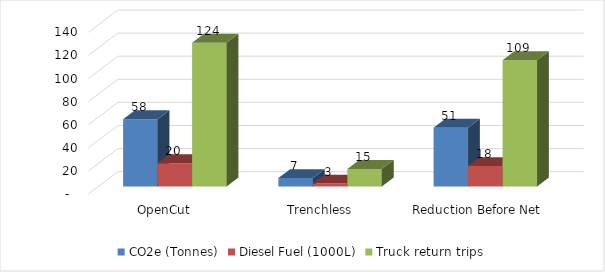
| Category | CO2e (Tonnes) | Diesel Fuel (1000L) | Truck return trips |
|---|---|---|---|
| OpenCut | 58.199 | 20.131 | 124.498 |
| Trenchless | 7.251 | 2.508 | 15.208 |
| Reduction Before Net Down | 50.948 | 17.624 | 109.291 |